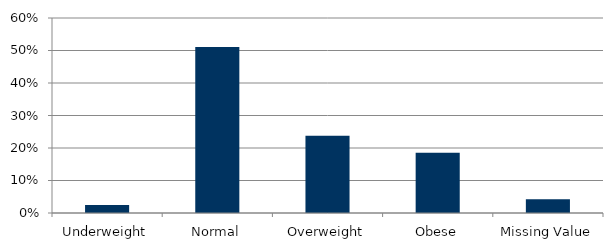
| Category | Total |
|---|---|
| Underweight | 0.024 |
| Normal | 0.51 |
| Overweight | 0.238 |
| Obese | 0.185 |
| Missing Value | 0.042 |